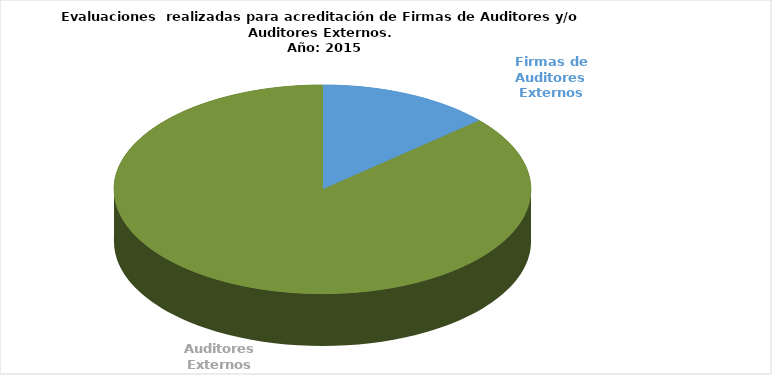
| Category | Series 0 |
|---|---|
| Firmas de Auditores Externos | 5 |
| Auditores Externos | 32 |